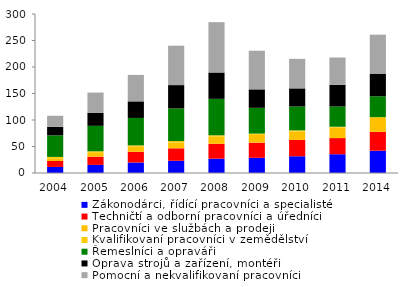
| Category | Zákonodárci, řídící pracovníci a specialisté | Techničtí a odborní pracovníci a úředníci | Pracovníci ve službách a prodeji | Kvalifikovaní pracovníci v zemědělství | Řemeslníci a opraváři | Oprava strojů a zařízení, montéři | Pomocní a nekvalifikovaní pracovníci |
|---|---|---|---|---|---|---|---|
| 2004.0 | 11.465 | 11.139 | 5.038 | 2.71 | 40.653 | 16.059 | 20.92 |
| 2005.0 | 15.309 | 15.48 | 7.216 | 2.905 | 48.048 | 24.402 | 38.376 |
| 2006.0 | 19.785 | 20.204 | 9.514 | 2.539 | 51.854 | 31.26 | 49.919 |
| 2007.0 | 23.099 | 23.51 | 11.092 | 2.439 | 61.716 | 43.996 | 74.39 |
| 2008.0 | 27.045 | 28.012 | 13.483 | 2.593 | 68.775 | 49.738 | 94.905 |
| 2009.0 | 28.714 | 28.55 | 14.624 | 2.429 | 48.601 | 34.906 | 72.885 |
| 2010.0 | 31.6 | 30.792 | 15.977 | 2.016 | 45.071 | 34.227 | 55.684 |
| 2011.0 | 35.433 | 30.448 | 19.756 | 1.626 | 38.192 | 40.999 | 51.408 |
| 2014.0 | 42.078 | 35.573 | 26.154 | 1.54 | 39.44 | 42.733 | 73.481 |